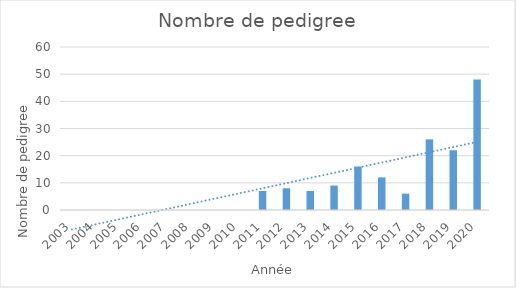
| Category | Series 0 |
|---|---|
| 2003.0 | 0 |
| 2004.0 | 0 |
| 2005.0 | 0 |
| 2006.0 | 0 |
| 2007.0 | 0 |
| 2008.0 | 0 |
| 2009.0 | 0 |
| 2010.0 | 0 |
| 2011.0 | 7 |
| 2012.0 | 8 |
| 2013.0 | 7 |
| 2014.0 | 9 |
| 2015.0 | 16 |
| 2016.0 | 12 |
| 2017.0 | 6 |
| 2018.0 | 26 |
| 2019.0 | 22 |
| 2020.0 | 48 |